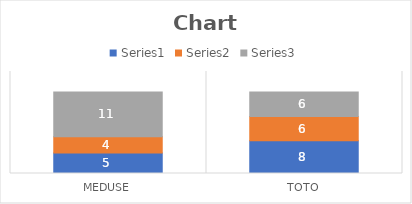
| Category | Series 0 | Series 1 | Series 2 |
|---|---|---|---|
| meduse | 5 | 4 | 11 |
| toto | 8 | 6 | 6 |